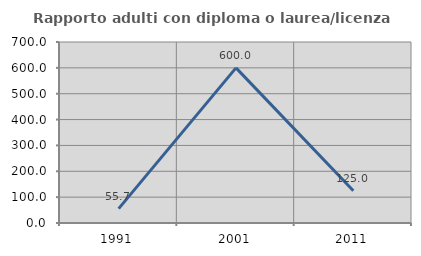
| Category | Rapporto adulti con diploma o laurea/licenza media  |
|---|---|
| 1991.0 | 55.738 |
| 2001.0 | 600 |
| 2011.0 | 125 |